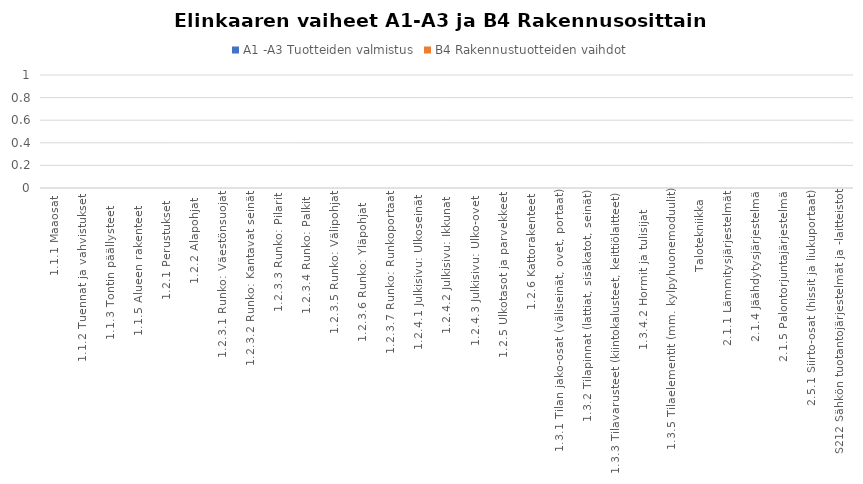
| Category | A1 -A3 Tuotteiden valmistus | B4 Rakennustuotteiden vaihdot |
|---|---|---|
| 1.1.1 Maaosat | 0 | 0 |
| 1.1.2 Tuennat ja vahvistukset  | 0 | 0 |
| 1.1.3 Tontin päällysteet     | 0 | 0 |
| 1.1.5 Alueen rakenteet     | 0 | 0 |
| 1.2.1 Perustukset   | 0 | 0 |
| 1.2.2 Alapohjat  | 0 | 0 |
| 1.2.3.1 Runko: Väestönsuojat | 0 | 0 |
| 1.2.3.2 Runko: Kantavat seinät | 0 | 0 |
| 1.2.3.3 Runko: Pilarit | 0 | 0 |
| 1.2.3.4 Runko: Palkit  | 0 | 0 |
| 1.2.3.5 Runko: Välipohjat | 0 | 0 |
| 1.2.3.6 Runko: Yläpohjat    | 0 | 0 |
| 1.2.3.7 Runko: Runkoportaat | 0 | 0 |
| 1.2.4.1 Julkisivu: Ulkoseinät  | 0 | 0 |
| 1.2.4.2 Julkisivu: Ikkunat  | 0 | 0 |
| 1.2.4.3 Julkisivu: Ulko-ovet  | 0 | 0 |
| 1.2.5 Ulkotasot ja parvekkeet | 0 | 0 |
| 1.2.6 Kattorakenteet | 0 | 0 |
| 1.3.1 Tilan jako-osat (väliseinät, ovet, portaat)  | 0 | 0 |
| 1.3.2 Tilapinnat (lattiat, sisäkatot, seinät) | 0 | 0 |
| 1.3.3 Tilavarusteet (kiintokalusteet, keittiölaitteet)  | 0 | 0 |
| 1.3.4.2 Hormit ja tulisijat      | 0 | 0 |
| 1.3.5 Tilaelementit (mm. kylpyhuonemoduulit) | 0 | 0 |
| Talotekniikka | 0 | 0 |
| 2.1.1 Lämmitysjärjestelmät | 0 | 0 |
| 2.1.4 Jäähdytysjärjestelmä | 0 | 0 |
| 2.1.5 Palontorjuntajärjestelmä | 0 | 0 |
| 2.5.1 Siirto-osat (hissit ja liukuportaat) | 0 | 0 |
| S212 Sähkön tuotantojärjestelmät ja -laitteistot | 0 | 0 |